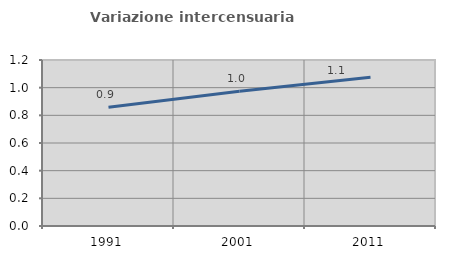
| Category | Variazione intercensuaria annua |
|---|---|
| 1991.0 | 0.858 |
| 2001.0 | 0.974 |
| 2011.0 | 1.075 |